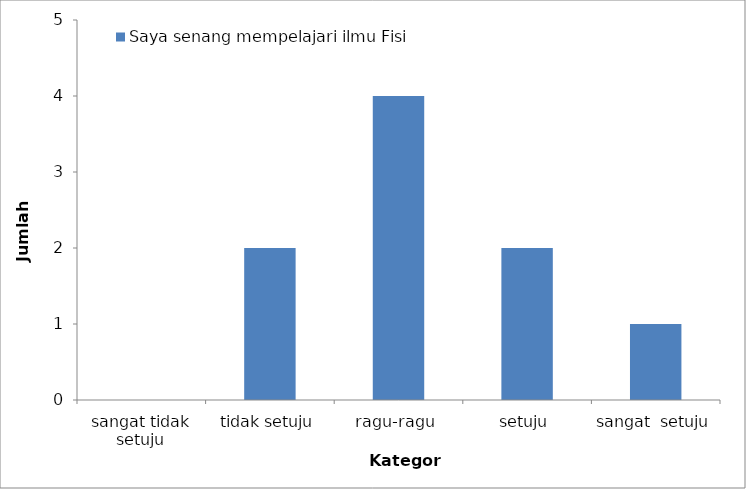
| Category | Saya senang mempelajari ilmu Fisika |
|---|---|
| sangat tidak setuju | 0 |
| tidak setuju | 2 |
| ragu-ragu | 4 |
| setuju | 2 |
| sangat  setuju | 1 |